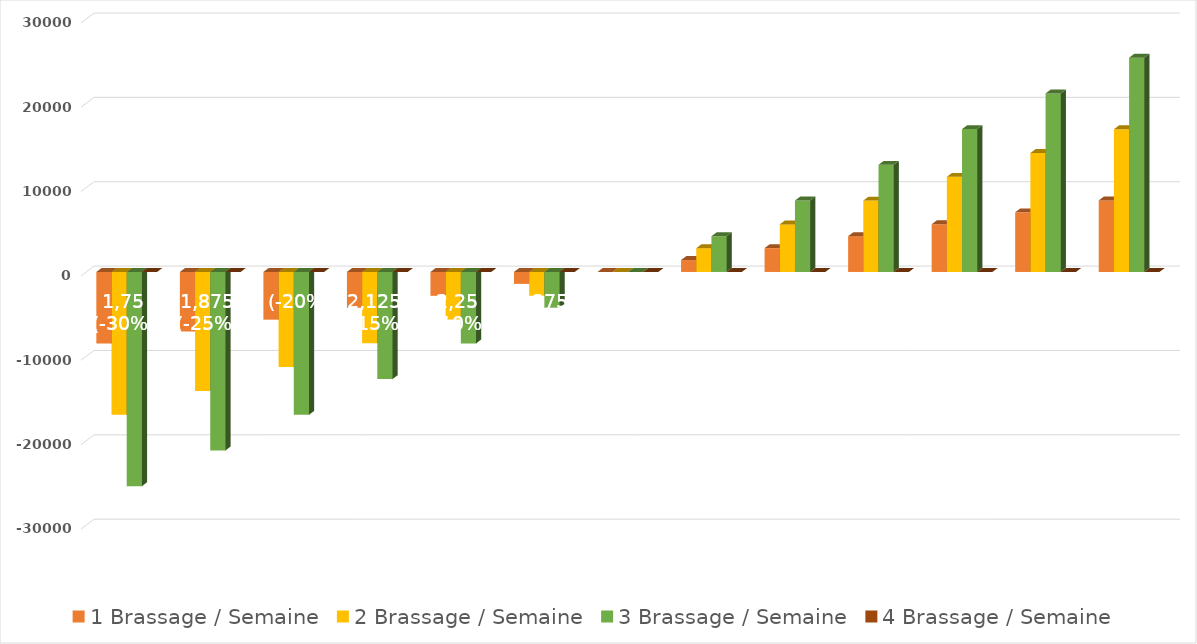
| Category | 1 Brassage / Semaine | 2 Brassage / Semaine | 3 Brassage / Semaine | 4 Brassage / Semaine |
|---|---|---|---|---|
| 1,75 (-30%) | -8482.827 | -16916.694 | -25399.522 | 0 |
| 1,875 (-25%) | -7069.023 | -14097.245 | -21166.268 | 0 |
| 2 (-20%) | -5655.218 | -11277.796 | -16933.014 | 0 |
| 2,125 (-15%) | -4241.414 | -8458.347 | -12699.761 | 0 |
| 2,25 (-10%) | -2827.609 | -5638.898 | -8466.507 | 0 |
| 2,375 (-5%) | -1413.805 | -2819.449 | -4233.254 | 0 |
| 2,50 | 0 | 0 | 0 | 0 |
| 2,625 (+5%) | 1413.805 | 2819.449 | 4233.254 | 0 |
| 2,75 (+10%) | 2827.609 | 5638.898 | 8466.507 | 0 |
| 2,875 (+15%) | 4241.414 | 8458.347 | 12699.761 | 0 |
| 3 (+20%) | 5655.218 | 11277.796 | 16933.014 | 0 |
| 3,125 (+25%) | 7069.023 | 14097.245 | 21166.268 | 0 |
| 3,25 (+30%) | 8482.827 | 16916.694 | 25399.522 | 0 |